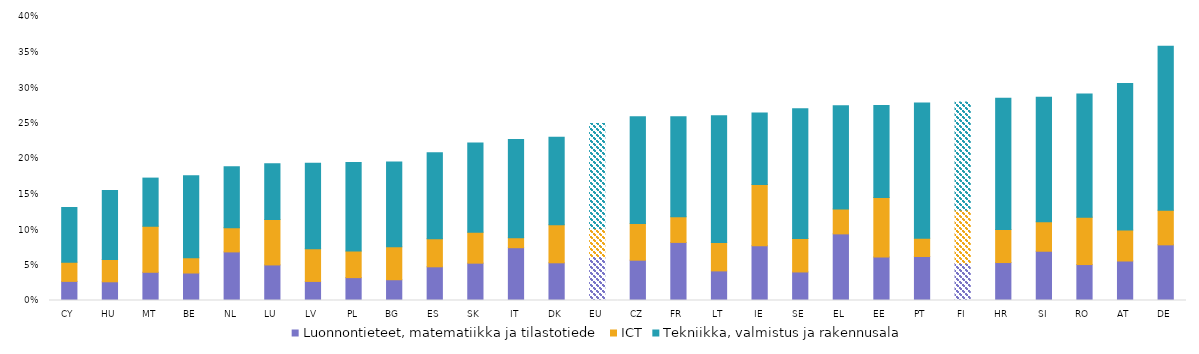
| Category | Luonnontieteet, matematiikka ja tilastotiede | ICT | Tekniikka, valmistus ja rakennusala |
|---|---|---|---|
| CY | 0.027 | 0.027 | 0.077 |
| HU | 0.026 | 0.031 | 0.097 |
| MT | 0.04 | 0.065 | 0.068 |
| BE | 0.039 | 0.022 | 0.116 |
| NL | 0.068 | 0.034 | 0.086 |
| LU | 0.05 | 0.064 | 0.078 |
| LV | 0.027 | 0.046 | 0.12 |
| PL | 0.032 | 0.037 | 0.125 |
| BG | 0.029 | 0.046 | 0.119 |
| ES | 0.047 | 0.04 | 0.121 |
| SK | 0.053 | 0.044 | 0.126 |
| IT | 0.074 | 0.014 | 0.138 |
| DK | 0.053 | 0.054 | 0.123 |
| EU | 0.062 | 0.039 | 0.148 |
| CZ | 0.057 | 0.052 | 0.15 |
| FR | 0.082 | 0.036 | 0.141 |
| LT | 0.042 | 0.04 | 0.179 |
| IE | 0.077 | 0.086 | 0.101 |
| SE | 0.04 | 0.047 | 0.183 |
| EL | 0.094 | 0.035 | 0.145 |
| EE | 0.061 | 0.084 | 0.13 |
| PT | 0.062 | 0.026 | 0.191 |
| FI | 0.052 | 0.075 | 0.152 |
| HR | 0.053 | 0.047 | 0.185 |
| SI | 0.069 | 0.041 | 0.176 |
| RO | 0.051 | 0.067 | 0.173 |
| AT | 0.056 | 0.044 | 0.207 |
| DE | 0.078 | 0.049 | 0.231 |